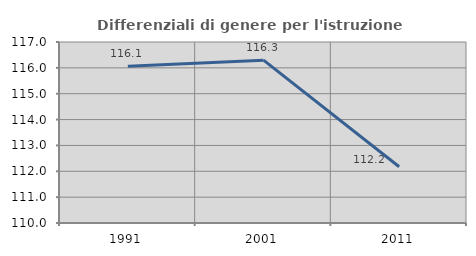
| Category | Differenziali di genere per l'istruzione superiore |
|---|---|
| 1991.0 | 116.063 |
| 2001.0 | 116.298 |
| 2011.0 | 112.174 |